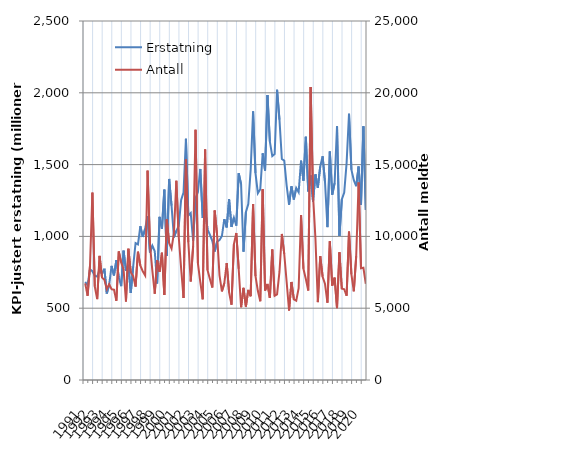
| Category | Erstatning |
|---|---|
| 1991.0 | 682.861 |
| nan | 660.593 |
| nan | 770.781 |
| nan | 757.68 |
| 1992.0 | 724.967 |
| nan | 720.337 |
| nan | 769.124 |
| nan | 738.283 |
| 1993.0 | 775.228 |
| nan | 602.058 |
| nan | 664.256 |
| nan | 794.965 |
| 1994.0 | 727.895 |
| nan | 835.014 |
| nan | 715.669 |
| nan | 653.422 |
| 1995.0 | 900.586 |
| nan | 761.203 |
| nan | 803.181 |
| nan | 605.711 |
| 1996.0 | 789.173 |
| nan | 953.39 |
| nan | 943.881 |
| nan | 1071.001 |
| 1997.0 | 996.152 |
| nan | 1053.434 |
| nan | 1142.066 |
| nan | 887.884 |
| 1998.0 | 935.373 |
| nan | 896.35 |
| nan | 671.783 |
| nan | 1136.193 |
| 1999.0 | 1052.729 |
| nan | 1325.657 |
| nan | 863.644 |
| nan | 1400.154 |
| 2000.0 | 1214.232 |
| nan | 993.707 |
| nan | 1038.895 |
| nan | 1072.169 |
| 2001.0 | 1253.265 |
| nan | 1304.559 |
| nan | 1679.765 |
| nan | 1144.776 |
| 2002.0 | 1162.727 |
| nan | 970.425 |
| nan | 1266.256 |
| nan | 1309.736 |
| 2003.0 | 1469.594 |
| nan | 1128.08 |
| nan | 1190.808 |
| nan | 1048.721 |
| 2004.0 | 1011.439 |
| nan | 967.557 |
| nan | 894.762 |
| nan | 963.959 |
| 2005.0 | 974.405 |
| nan | 1002.461 |
| nan | 1119.883 |
| nan | 1062.719 |
| 2006.0 | 1258.391 |
| nan | 1065.827 |
| nan | 1130.31 |
| nan | 1075.24 |
| 2007.0 | 1439.915 |
| nan | 1364.05 |
| nan | 893.677 |
| nan | 1169.116 |
| 2008.0 | 1224.519 |
| nan | 1465.019 |
| nan | 1870.593 |
| nan | 1441 |
| 2009.0 | 1301.099 |
| nan | 1328.36 |
| nan | 1578.846 |
| nan | 1458.773 |
| 2010.0 | 1984.188 |
| nan | 1660.479 |
| nan | 1559.014 |
| nan | 1574.052 |
| 2011.0 | 2021.055 |
| nan | 1813.246 |
| nan | 1538.78 |
| nan | 1527.545 |
| 2012.0 | 1353.017 |
| nan | 1220.672 |
| nan | 1348.959 |
| nan | 1256.877 |
| 2013.0 | 1337.311 |
| nan | 1307.667 |
| nan | 1527.592 |
| nan | 1388.401 |
| 2014.0 | 1693.847 |
| nan | 1313.108 |
| nan | 1424.554 |
| nan | 1243.361 |
| 2015.0 | 1432.487 |
| nan | 1339.063 |
| nan | 1487.095 |
| nan | 1558.19 |
| 2016.0 | 1375.58 |
| nan | 1064.405 |
| nan | 1591.137 |
| nan | 1290.489 |
| 2017.0 | 1371.785 |
| nan | 1767.479 |
| nan | 1003.271 |
| nan | 1257.841 |
| 2018.0 | 1305.9 |
| nan | 1512.06 |
| nan | 1853.654 |
| nan | 1464.441 |
| 2019.0 | 1391.758 |
| nan | 1349.421 |
| nan | 1486.971 |
| nan | 1218.36 |
| 2020.0 | 1766.411 |
| nan | 1183.175 |